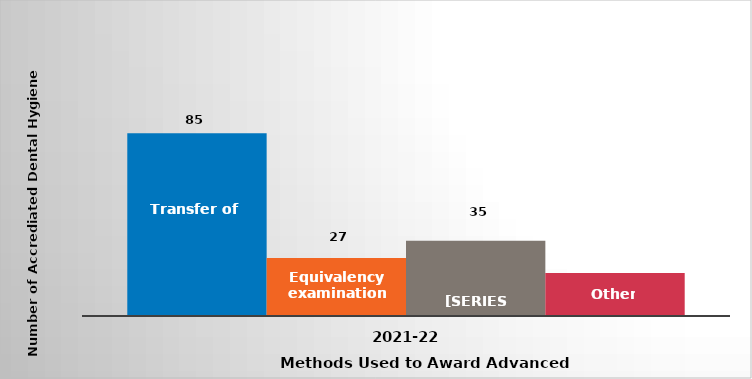
| Category | Transfer of credit | Equivalency examinations | Challenge examinations | Other |
|---|---|---|---|---|
| 2021-22 | 85 | 27 | 35 | 20 |